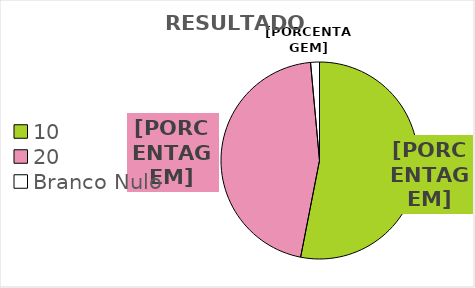
| Category | Series 0 |
|---|---|
| 10 | 0.531 |
| 20 | 0.455 |
| Branco Nulo | 0.015 |